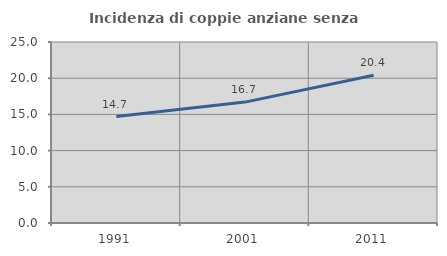
| Category | Incidenza di coppie anziane senza figli  |
|---|---|
| 1991.0 | 14.706 |
| 2001.0 | 16.698 |
| 2011.0 | 20.411 |